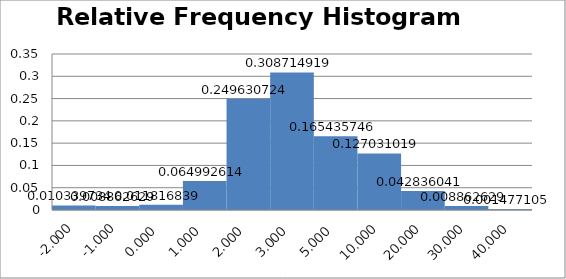
| Category | Series 0 |
|---|---|
| -2.0 | 0.01 |
| -1.0 | 0.009 |
| 0.0 | 0.012 |
| 1.0 | 0.065 |
| 2.0 | 0.25 |
| 3.0 | 0.309 |
| 5.0 | 0.165 |
| 10.0 | 0.127 |
| 20.0 | 0.043 |
| 30.0 | 0.009 |
| 40.0 | 0.001 |